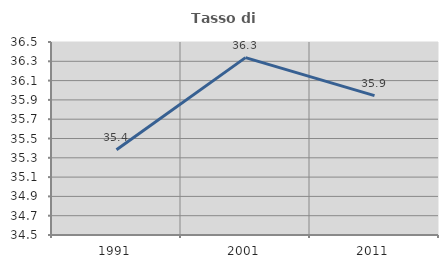
| Category | Tasso di occupazione   |
|---|---|
| 1991.0 | 35.383 |
| 2001.0 | 36.338 |
| 2011.0 | 35.945 |